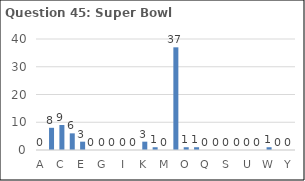
| Category | Series 0 |
|---|---|
| A | 0 |
| B | 8 |
| C | 9 |
| D | 6 |
| E | 3 |
| F | 0 |
| G | 0 |
| H | 0 |
| I | 0 |
| J | 0 |
| K | 3 |
| L | 1 |
| M | 0 |
| N | 37 |
| O | 1 |
| P | 1 |
| Q | 0 |
| R | 0 |
| S | 0 |
| T | 0 |
| U | 0 |
| V | 0 |
| W | 1 |
| X | 0 |
| Y | 0 |